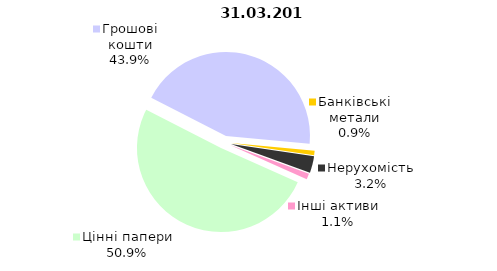
| Category | Всього |
|---|---|
| Цінні папери | 557.883 |
| Грошові кошти | 481.902 |
| Банківські метали | 9.455 |
| Нерухомість | 35.103 |
| Інші активи | 12.238 |